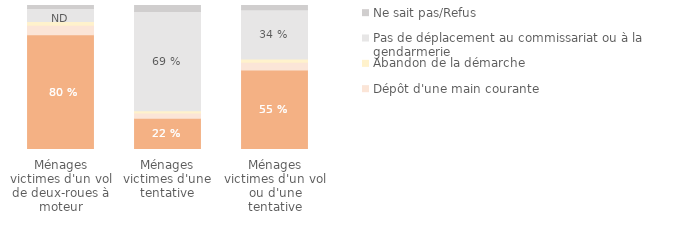
| Category | Dépôt de plainte | Dépôt d'une main courante | Abandon de la démarche | Pas de déplacement au commissariat ou à la gendarmerie | Ne sait pas/Refus |
|---|---|---|---|---|---|
| Ménages victimes d'un vol ou d'une tentative | 0.552 | 0.054 | 0.023 | 0.342 | 0.03 |
| Ménages victimes d'une tentative | 0.217 | 0.036 | 0.016 | 0.688 | 0.042 |
| Ménages victimes d'un vol de deux-roues à moteur | 0.796 | 0.066 | 0.027 | 0.089 | 0.021 |